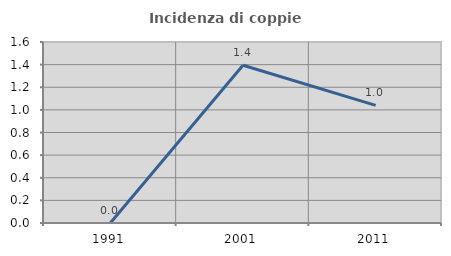
| Category | Incidenza di coppie miste |
|---|---|
| 1991.0 | 0 |
| 2001.0 | 1.395 |
| 2011.0 | 1.04 |